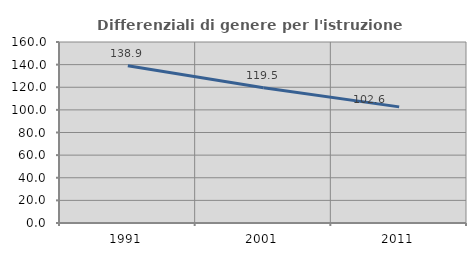
| Category | Differenziali di genere per l'istruzione superiore |
|---|---|
| 1991.0 | 138.935 |
| 2001.0 | 119.539 |
| 2011.0 | 102.64 |